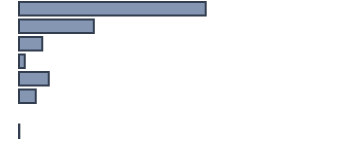
| Category | Percentatge |
|---|---|
| 0 | 55.4 |
| 1 | 22.2 |
| 2 | 6.9 |
| 3 | 1.7 |
| 4 | 8.8 |
| 5 | 5 |
| 6 | 0 |
| 7 | 0.1 |